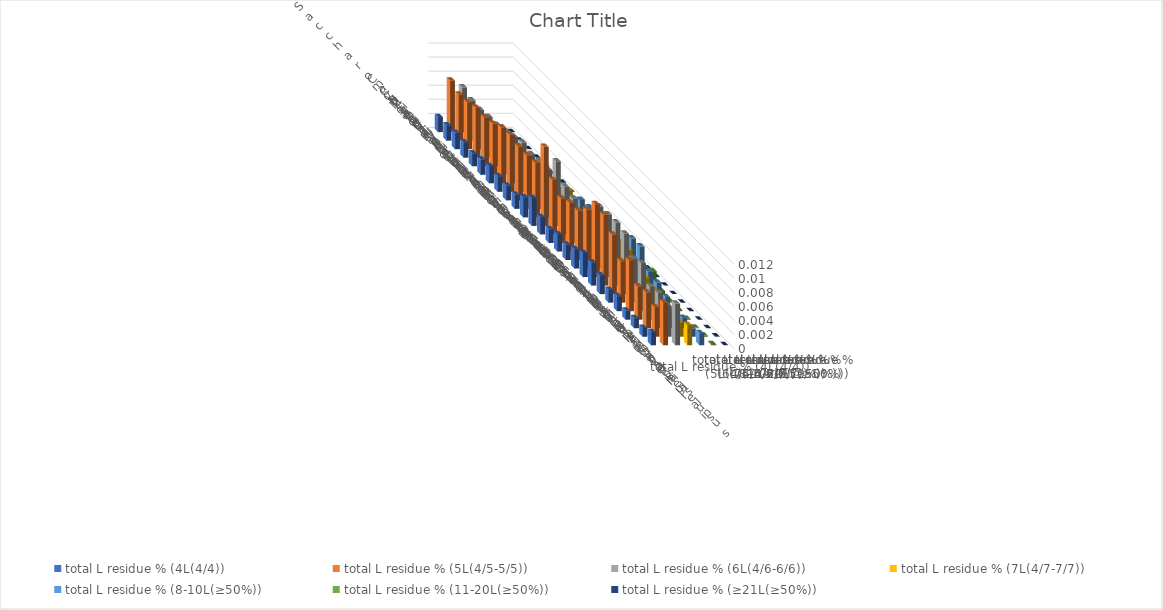
| Category | total L residue % (4L(4/4)) | total L residue % (5L(4/5-5/5)) | total L residue % (6L(4/6-6/6)) | total L residue % (7L(4/7-7/7)) | total L residue % (8-10L(≥50%)) | total L residue % (11-20L(≥50%)) | total L residue % (≥21L(≥50%)) |
|---|---|---|---|---|---|---|---|
| Saccharomyces cerevisiae S288c | 0.002 | 0.007 | 0.006 | 0.003 | 0.002 | 0 | 0 |
| Candida albicans | 0.002 | 0.007 | 0.006 | 0.003 | 0.002 | 0 | 0 |
| Candida auris | 0.002 | 0.007 | 0.006 | 0.003 | 0.002 | 0 | 0 |
| Candida tropicalis | 0.002 | 0.007 | 0.006 | 0.003 | 0.002 | 0 | 0 |
| Neurospora crassa | 0.002 | 0.007 | 0.006 | 0.003 | 0.002 | 0 | 0 |
| Magnaporthe oryzae | 0.002 | 0.007 | 0.006 | 0.003 | 0.002 | 0 | 0 |
| Trichoderma reesei | 0.002 | 0.008 | 0.007 | 0.003 | 0.002 | 0 | 0 |
| Cryptococcus neoformans | 0.002 | 0.008 | 0.007 | 0.003 | 0.003 | 0 | 0 |
| Ustilago maydis | 0.002 | 0.008 | 0.007 | 0.003 | 0.002 | 0 | 0 |
| Taiwanofungus camphoratus | 0.002 | 0.008 | 0.007 | 0.003 | 0.002 | 0 | 0 |
| Dictyostelium discoideum | 0.003 | 0.008 | 0.007 | 0.003 | 0.002 | 0 | 0 |
| Chlamydomonas reinhardtii | 0.004 | 0.011 | 0.009 | 0.005 | 0.004 | 0.001 | 0 |
| Drosophila melanogaster | 0.002 | 0.008 | 0.007 | 0.004 | 0.004 | 0.001 | 0 |
| Aedes aegypti | 0.002 | 0.006 | 0.006 | 0.003 | 0.002 | 0 | 0 |
| Plasmodium falciparum | 0.002 | 0.007 | 0.006 | 0.003 | 0.002 | 0 | 0 |
| Caenorhabditis elegans | 0.002 | 0.007 | 0.007 | 0.004 | 0.002 | 0 | 0 |
| Danio rerio | 0.003 | 0.008 | 0.009 | 0.004 | 0.003 | 0.001 | 0 |
| Mus musculus | 0.003 | 0.01 | 0.009 | 0.005 | 0.005 | 0.001 | 0 |
| Homo sapiens | 0.003 | 0.01 | 0.009 | 0.005 | 0.006 | 0.002 | 0 |
| Arabidopsis thaliana | 0.003 | 0.008 | 0.009 | 0.005 | 0.003 | 0 | 0 |
| Tetrahymena thermophila | 0.002 | 0.006 | 0.006 | 0.004 | 0.003 | 0 | 0 |
| Paramecium tetraurelia | 0.002 | 0.007 | 0.007 | 0.003 | 0.002 | 0 | 0 |
| Oxytricha trifallax | 0.001 | 0.005 | 0.005 | 0.002 | 0.001 | 0 | 0 |
| Stylonychia lemnae | 0.001 | 0.005 | 0.005 | 0.002 | 0.001 | 0 | 0 |
| Pseudocohnilembus persalinus | 0.001 | 0.004 | 0.004 | 0.002 | 0.001 | 0 | 0 |
| Stentor coeruleus | 0.002 | 0.006 | 0.006 | 0.003 | 0.002 | 0 | 0 |